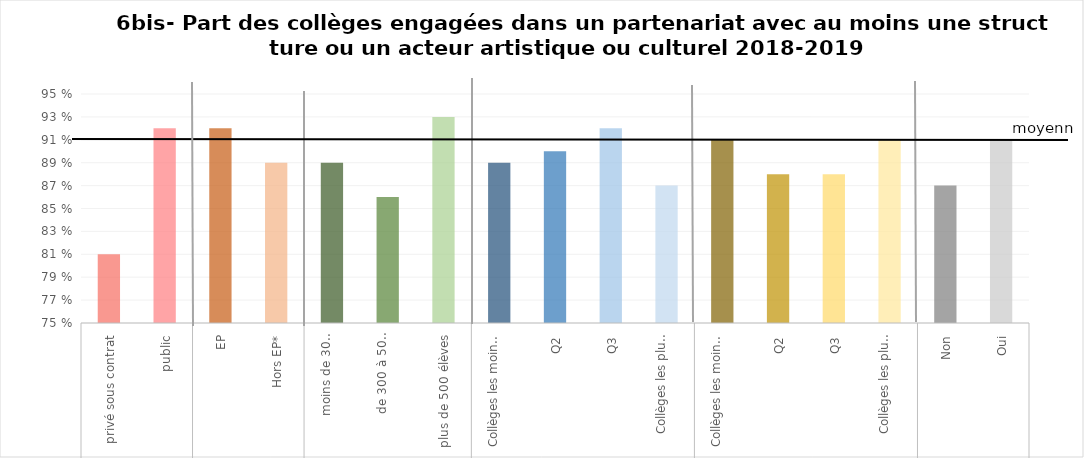
| Category | Series 1 |
|---|---|
| 0 | 0.81 |
| 1 | 0.92 |
| 2 | 0.92 |
| 3 | 0.89 |
| 4 | 0.89 |
| 5 | 0.86 |
| 6 | 0.93 |
| 7 | 0.89 |
| 8 | 0.9 |
| 9 | 0.92 |
| 10 | 0.87 |
| 11 | 0.91 |
| 12 | 0.88 |
| 13 | 0.88 |
| 14 | 0.91 |
| 15 | 0.87 |
| 16 | 0.91 |